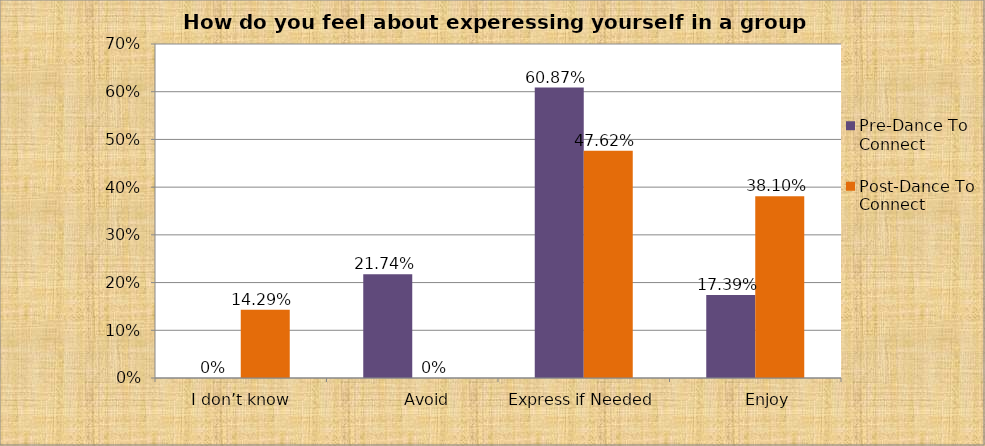
| Category | Pre-Dance To Connect | Post-Dance To Connect |
|---|---|---|
|  I don’t know | 0 | 0.143 |
|        Avoid | 0.217 | 0 |
| Express if Needed | 0.609 | 0.476 |
|       Enjoy | 0.174 | 0.381 |